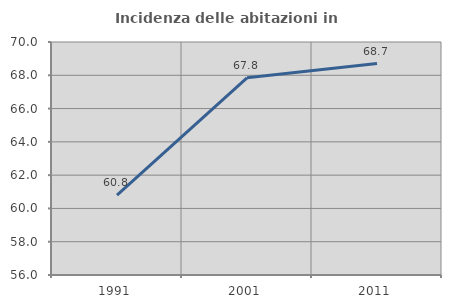
| Category | Incidenza delle abitazioni in proprietà  |
|---|---|
| 1991.0 | 60.802 |
| 2001.0 | 67.848 |
| 2011.0 | 68.708 |